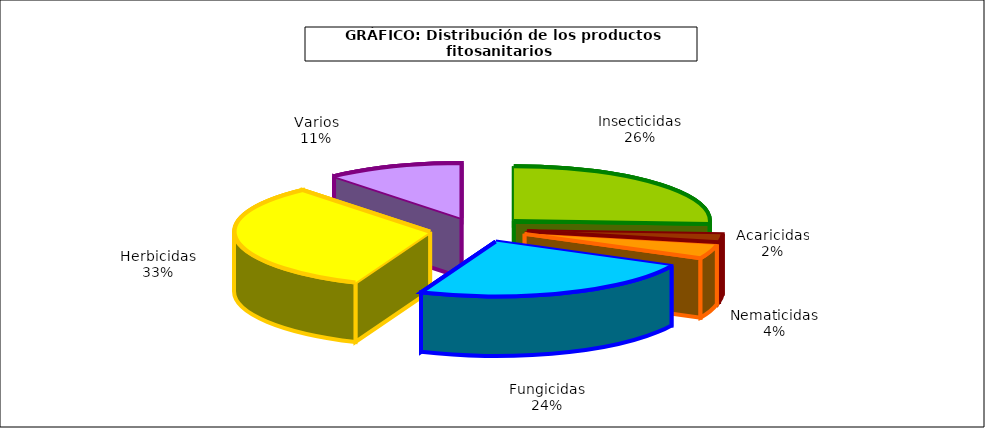
| Category | Insecticidas Acaricidas Nematicidas Fungicidas Herbicidas Varios |
|---|---|
| Insecticidas | 294.442 |
| Acaricidas | 27.081 |
| Nematicidas | 46.818 |
| Fungicidas | 272.711 |
| Herbicidas | 370.971 |
| Varios | 128.333 |